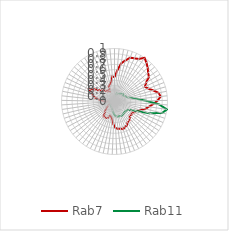
| Category | Rab7 | Rab11 |
|---|---|---|
| 0.0 | 0.459 | 0.081 |
| 0.10913 | 0.583 | 0.105 |
| 0.21825 | 0.73 | 0.129 |
| 0.32738 | 0.801 | 0.162 |
| 0.43651 | 0.878 | 0.157 |
| 0.54563 | 0.896 | 0.15 |
| 0.65476 | 0.923 | 0.166 |
| 0.76389 | 1 | 0.178 |
| 0.87302 | 0.949 | 0.189 |
| 0.98214 | 0.896 | 0.203 |
| 1.09127 | 0.835 | 0.216 |
| 1.2004 | 0.801 | 0.197 |
| 1.30952 | 0.696 | 0.19 |
| 1.41865 | 0.637 | 0.229 |
| 1.52778 | 0.681 | 0.243 |
| 1.6369 | 0.759 | 0.27 |
| 1.74603 | 0.848 | 0.343 |
| 1.85516 | 0.875 | 0.442 |
| 1.96429 | 0.812 | 0.598 |
| 2.07341 | 0.734 | 0.844 |
| 2.18254 | 0.656 | 1 |
| 2.29167 | 0.598 | 0.924 |
| 2.40079 | 0.507 | 0.7 |
| 2.50992 | 0.45 | 0.451 |
| 2.61905 | 0.43 | 0.336 |
| 2.72817 | 0.387 | 0.287 |
| 2.8373 | 0.409 | 0.28 |
| 2.94643 | 0.392 | 0.273 |
| 3.05556 | 0.434 | 0.273 |
| 3.16468 | 0.46 | 0.283 |
| 3.27381 | 0.464 | 0.292 |
| 3.38294 | 0.512 | 0.301 |
| 3.49206 | 0.519 | 0.297 |
| 3.60119 | 0.549 | 0.285 |
| 3.71032 | 0.523 | 0.292 |
| 3.81944 | 0.522 | 0.278 |
| 3.92857 | 0.502 | 0.269 |
| 4.0377 | 0.437 | 0.238 |
| 4.14683 | 0.331 | 0.203 |
| 4.25595 | 0.295 | 0.169 |
| 4.36508 | 0.273 | 0.148 |
| 4.47421 | 0.337 | 0.147 |
| 4.58333 | 0.347 | 0.123 |
| 4.69246 | 0.35 | 0.122 |
| 4.80159 | 0.344 | 0.112 |
| 4.91071 | 0.263 | 0.107 |
| 5.01984 | 0.239 | 0.097 |
| 5.12897 | 0.19 | 0.088 |
| 5.2381 | 0.145 | 0.087 |
| 5.34722 | 0.124 | 0.069 |
| 5.45635 | 0.052 | 0.072 |
| 5.56548 | 0.046 | 0.082 |
| 5.6746 | 0.012 | 0.05 |
| 5.78373 | 0 | 0.035 |
| 5.89286 | 0.072 | 0.043 |
| 6.00198 | 0.192 | 0.067 |
| 6.11111 | 0.271 | 0.08 |
| 6.22024 | 0.372 | 0.084 |
| 6.32937 | 0.425 | 0.059 |
| 6.43849 | 0.458 | 0.049 |
| 6.54762 | 0.541 | 0.057 |
| 6.65675 | 0.451 | 0.043 |
| 6.76587 | 0.367 | 0.032 |
| 6.875 | 0.321 | 0.032 |
| 6.98413 | 0.294 | 0.026 |
| 7.09325 | 0.263 | 0.015 |
| 7.20238 | 0.229 | 0 |
| 7.31151 | 0.24 | 0.013 |
| 7.42063 | 0.208 | 0.004 |
| 7.52976 | 0.319 | 0.006 |
| 7.63889 | 0.338 | 0.014 |
| 7.74802 | 0.367 | 0.059 |
| 7.85714 | 0.474 | 0.08 |